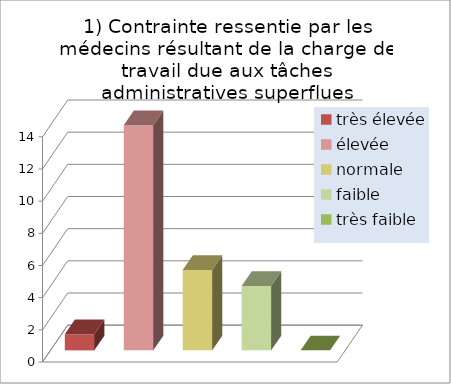
| Category | Comment évaluez-vous la charge de travail découlant des tâches administratives superflues? |
|---|---|
| très élevée | 1 |
| élevée | 14 |
| normale | 5 |
| faible | 4 |
| très faible | 0 |